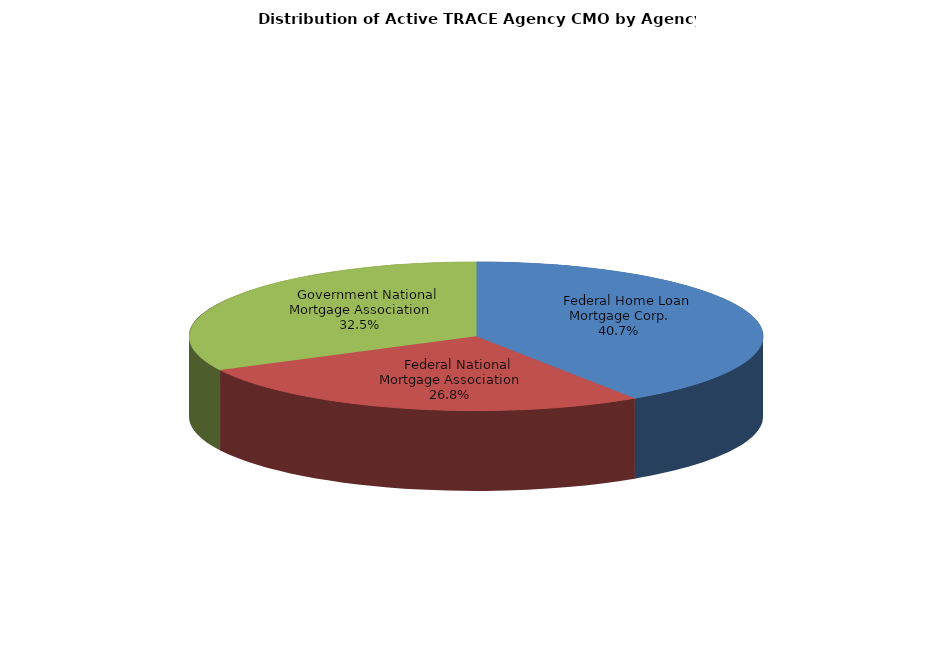
| Category | Series 0 |
|---|---|
|     Federal Home Loan Mortgage Corp. | 99488 |
|     Federal National Mortgage Association | 65553 |
|     Government National Mortgage Association | 79499 |